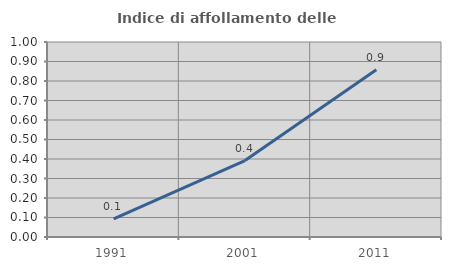
| Category | Indice di affollamento delle abitazioni  |
|---|---|
| 1991.0 | 0.093 |
| 2001.0 | 0.392 |
| 2011.0 | 0.857 |